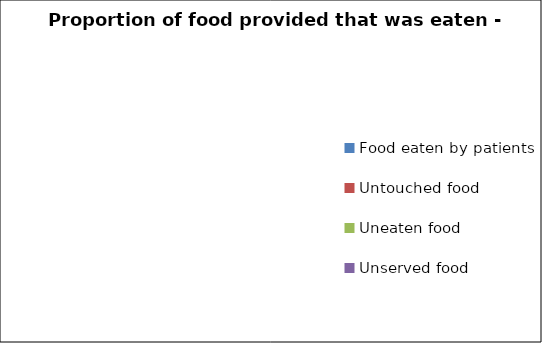
| Category | Proportion of food provided that was eaten - breakfast |
|---|---|
| Food eaten by patients | 0 |
| Untouched food | 0 |
| Uneaten food | 0 |
| Unserved food | 0 |